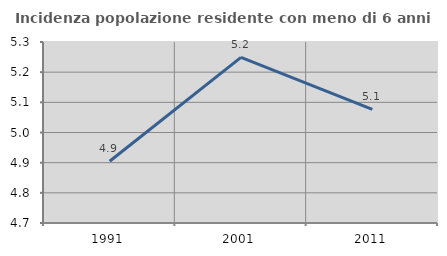
| Category | Incidenza popolazione residente con meno di 6 anni |
|---|---|
| 1991.0 | 4.905 |
| 2001.0 | 5.249 |
| 2011.0 | 5.077 |